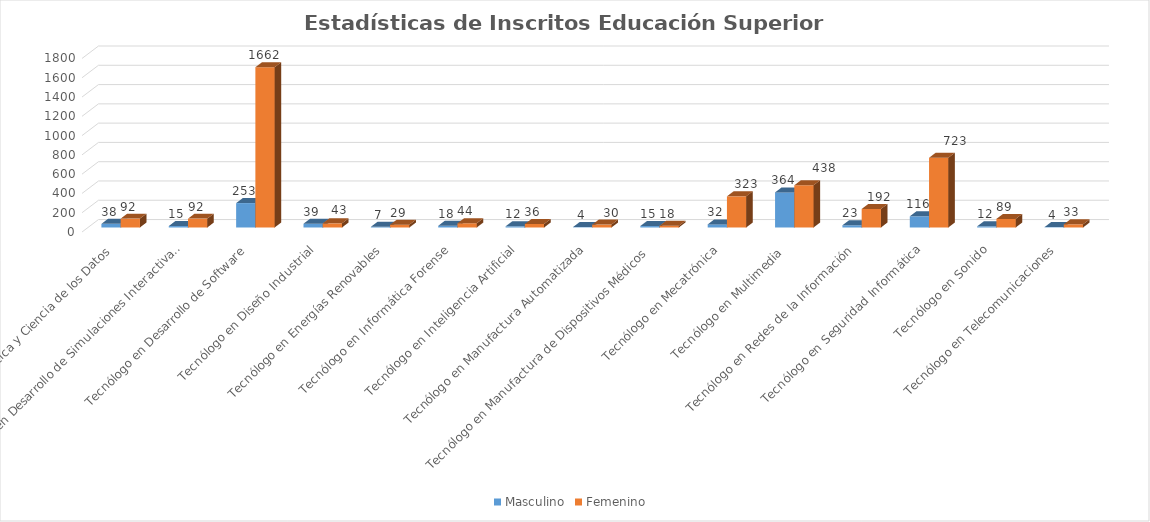
| Category | Masculino | Femenino  |
|---|---|---|
| Tecnólogo en Analítica y Ciencia de los Datos | 38 | 92 |
| Tecnólogo en Desarrollo de Simulaciones Interactivas y Videojuegos | 15 | 92 |
| Tecnólogo en Desarrollo de Software | 253 | 1662 |
| Tecnólogo en Diseño Industrial | 39 | 43 |
| Tecnólogo en Energías Renovables | 7 | 29 |
| Tecnólogo en Informática Forense | 18 | 44 |
| Tecnólogo en Inteligencia Artificial | 12 | 36 |
| Tecnólogo en Manufactura Automatizada | 4 | 30 |
| Tecnólogo en Manufactura de Dispositivos Médicos  | 15 | 18 |
| Tecnólogo en Mecatrónica | 32 | 323 |
| Tecnólogo en Multimedia  | 364 | 438 |
| Tecnólogo en Redes de la Información | 23 | 192 |
| Tecnólogo en Seguridad Informática | 116 | 723 |
| Tecnólogo en Sonido | 12 | 89 |
| Tecnólogo en Telecomunicaciones | 4 | 33 |